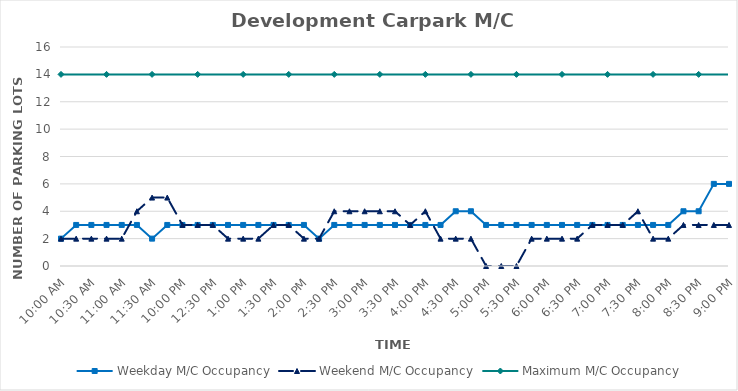
| Category | Weekday M/C Occupancy | Weekend M/C Occupancy | Maximum M/C Occupancy |
|---|---|---|---|
| 0.4166666666666667 | 2 | 2 | 14 |
| 0.4270833333333333 | 3 | 2 | 14 |
| 0.4375 | 3 | 2 | 14 |
| 0.4479166666666667 | 3 | 2 | 14 |
| 0.4583333333333333 | 3 | 2 | 14 |
| 0.46875 | 3 | 4 | 14 |
| 0.4791666666666667 | 2 | 5 | 14 |
| 0.4895833333333333 | 3 | 5 | 14 |
| 0.5 | 3 | 3 | 14 |
| 0.5104166666666666 | 3 | 3 | 14 |
| 0.5208333333333334 | 3 | 3 | 14 |
| 0.53125 | 3 | 2 | 14 |
| 0.5416666666666666 | 3 | 2 | 14 |
| 0.5520833333333334 | 3 | 2 | 14 |
| 0.5625 | 3 | 3 | 14 |
| 0.5729166666666666 | 3 | 3 | 14 |
| 0.5833333333333334 | 3 | 2 | 14 |
| 0.59375 | 2 | 2 | 14 |
| 0.604166666666667 | 3 | 4 | 14 |
| 0.614583333333334 | 3 | 4 | 14 |
| 0.625 | 3 | 4 | 14 |
| 0.635416666666667 | 3 | 4 | 14 |
| 0.645833333333334 | 3 | 4 | 14 |
| 0.656250000000001 | 3 | 3 | 14 |
| 0.666666666666667 | 3 | 4 | 14 |
| 0.677083333333334 | 3 | 2 | 14 |
| 0.687500000000001 | 4 | 2 | 14 |
| 0.697916666666668 | 4 | 2 | 14 |
| 0.708333333333335 | 3 | 0 | 14 |
| 0.718750000000002 | 3 | 0 | 14 |
| 0.729166666666669 | 3 | 0 | 14 |
| 0.739583333333336 | 3 | 2 | 14 |
| 0.75 | 3 | 2 | 14 |
| 0.7604166666666666 | 3 | 2 | 14 |
| 0.7708333333333334 | 3 | 2 | 14 |
| 0.78125 | 3 | 3 | 14 |
| 0.7916666666666666 | 3 | 3 | 14 |
| 0.8020833333333334 | 3 | 3 | 14 |
| 0.8125 | 3 | 4 | 14 |
| 0.8229166666666666 | 3 | 2 | 14 |
| 0.8333333333333334 | 3 | 2 | 14 |
| 0.84375 | 4 | 3 | 14 |
| 0.8541666666666666 | 4 | 3 | 14 |
| 0.8645833333333334 | 6 | 3 | 14 |
| 0.875 | 6 | 3 | 14 |